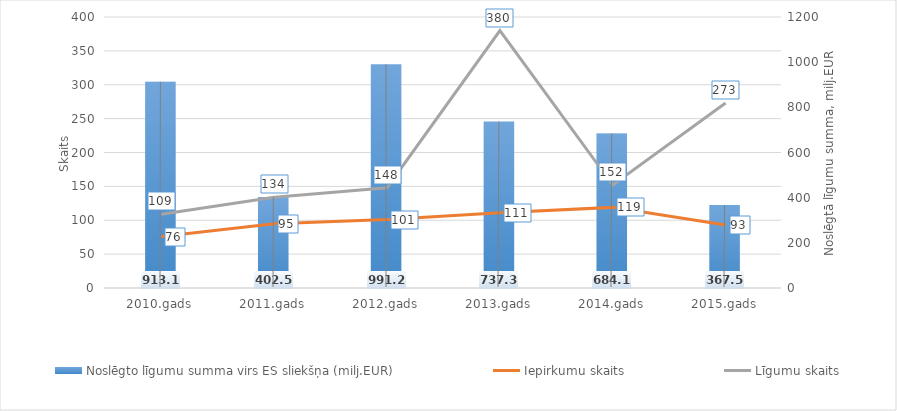
| Category | Noslēgto līgumu summa virs ES sliekšņa (milj.EUR) |
|---|---|
| 2010.gads | 913.1 |
| 2011.gads | 402.5 |
| 2012.gads | 991.2 |
| 2013.gads | 737.3 |
| 2014.gads | 684.1 |
| 2015.gads | 367.5 |